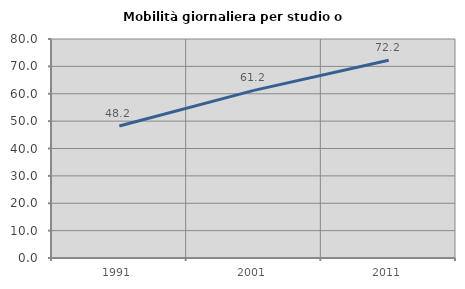
| Category | Mobilità giornaliera per studio o lavoro |
|---|---|
| 1991.0 | 48.238 |
| 2001.0 | 61.229 |
| 2011.0 | 72.206 |